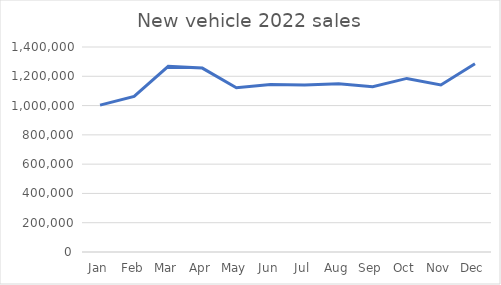
| Category | Series 0 |
|---|---|
| Jan | 1002739 |
| Feb | 1062812 |
| Mar | 1267623 |
| Apr | 1255970 |
| May | 1121835 |
| Jun | 1144405 |
| Jul | 1140528 |
| Aug | 1148948 |
| Sep | 1129298 |
| Oct | 1185463 |
| Nov | 1140431 |
| Dec | 1285553 |